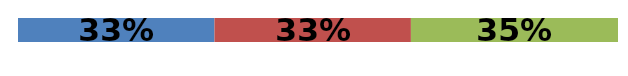
| Category | Series 0 | Series 1 | Series 2 |
|---|---|---|---|
| 0 | 0.327 | 0.327 | 0.345 |